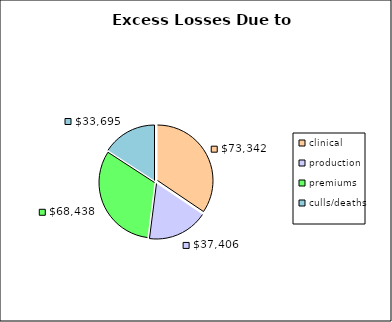
| Category | Losses |
|---|---|
| clinical | 73341.607 |
| production | 37406.35 |
| premiums | 68437.5 |
| culls/deaths | 33695 |